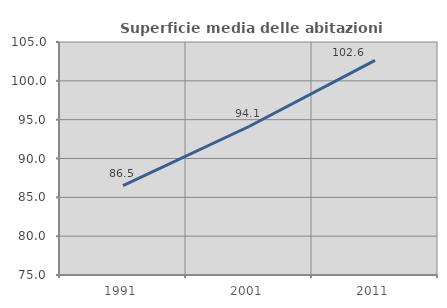
| Category | Superficie media delle abitazioni occupate |
|---|---|
| 1991.0 | 86.521 |
| 2001.0 | 94.12 |
| 2011.0 | 102.643 |